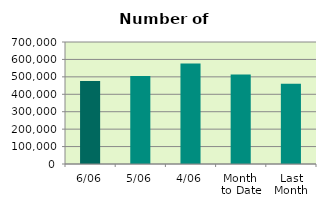
| Category | Series 0 |
|---|---|
| 6/06 | 475638 |
| 5/06 | 504454 |
| 4/06 | 576794 |
| Month 
to Date | 514019.5 |
| Last
Month | 461152.818 |